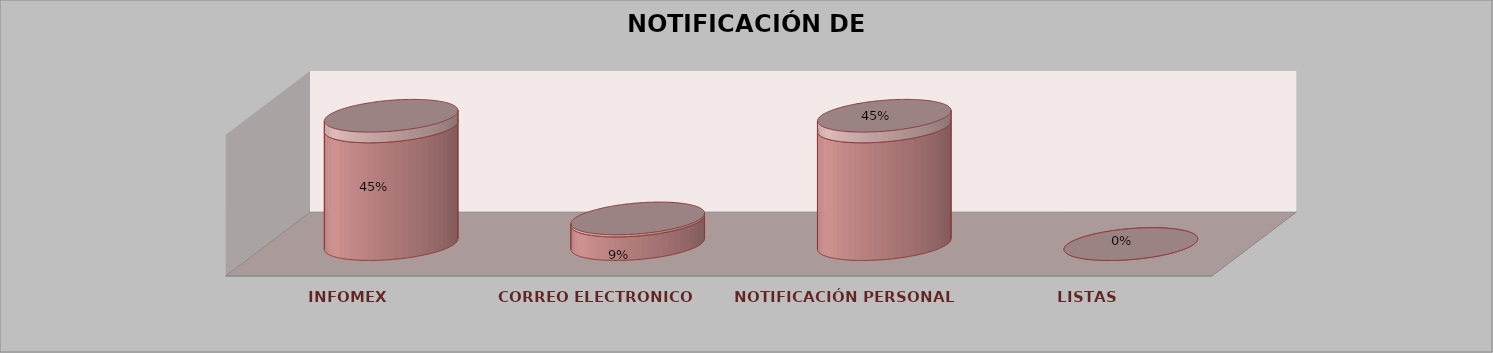
| Category | Series 0 | Series 1 | Series 2 | Series 3 | Series 4 |
|---|---|---|---|---|---|
| INFOMEX |  |  |  | 5 | 0.455 |
| CORREO ELECTRONICO |  |  |  | 1 | 0.091 |
| NOTIFICACIÓN PERSONAL |  |  |  | 5 | 0.455 |
| LISTAS |  |  |  | 0 | 0 |